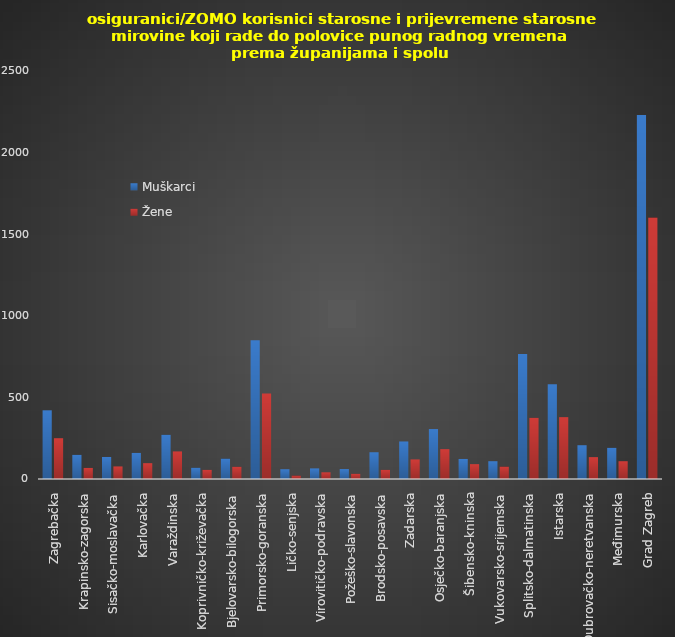
| Category | Muškarci | Žene |
|---|---|---|
| Zagrebačka | 421 | 250 |
| Krapinsko-zagorska | 148 | 68 |
| Sisačko-moslavačka | 135 | 77 |
| Karlovačka | 160 | 97 |
| Varaždinska | 271 | 169 |
| Koprivničko-križevačka | 69 | 56 |
| Bjelovarsko-bilogorska | 125 | 75 |
| Primorsko-goranska | 850 | 524 |
| Ličko-senjska | 60 | 21 |
| Virovitičko-podravska | 65 | 41 |
| Požeško-slavonska | 61 | 32 |
| Brodsko-posavska | 164 | 56 |
| Zadarska | 230 | 120 |
| Osječko-baranjska | 306 | 183 |
| Šibensko-kninska | 123 | 91 |
| Vukovarsko-srijemska | 109 | 76 |
| Splitsko-dalmatinska | 766 | 375 |
| Istarska | 580 | 379 |
| Dubrovačko-neretvanska | 207 | 134 |
| Međimurska | 191 | 109 |
| Grad Zagreb | 2231 | 1602 |